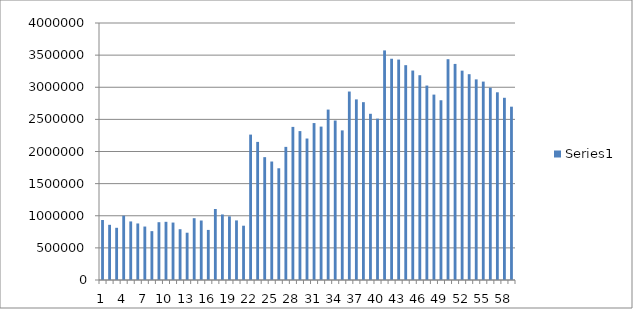
| Category | Series 0 |
|---|---|
| 0 | 933500 |
| 1 | 859000 |
| 2 | 812500 |
| 3 | 1001000 |
| 4 | 911500 |
| 5 | 880000 |
| 6 | 832000 |
| 7 | 760500 |
| 8 | 899500 |
| 9 | 905500 |
| 10 | 894000 |
| 11 | 790500 |
| 12 | 736000 |
| 13 | 962000 |
| 14 | 926000 |
| 15 | 779500 |
| 16 | 1105500 |
| 17 | 1020000 |
| 18 | 990500 |
| 19 | 927500 |
| 20 | 845000 |
| 21 | 2263000 |
| 22 | 2149500 |
| 23 | 1912000 |
| 24 | 1844000 |
| 25 | 1739000 |
| 26 | 2072000 |
| 27 | 2383000 |
| 28 | 2317500 |
| 29 | 2202000 |
| 30 | 2442500 |
| 31 | 2387500 |
| 32 | 2652500 |
| 33 | 2482100 |
| 34 | 2328500 |
| 35 | 2933300 |
| 36 | 2810900 |
| 37 | 2767700 |
| 38 | 2586900 |
| 39 | 2511700 |
| 40 | 3573300 |
| 41 | 3443700 |
| 42 | 3430700 |
| 43 | 3343700 |
| 44 | 3260200 |
| 45 | 3187200 |
| 46 | 3026400 |
| 47 | 2885600 |
| 48 | 2797600 |
| 49 | 3436800 |
| 50 | 3363200 |
| 51 | 3258400 |
| 52 | 3203200 |
| 53 | 3122400 |
| 54 | 3088000 |
| 55 | 2992800 |
| 56 | 2921600 |
| 57 | 2836000 |
| 58 | 2697600 |